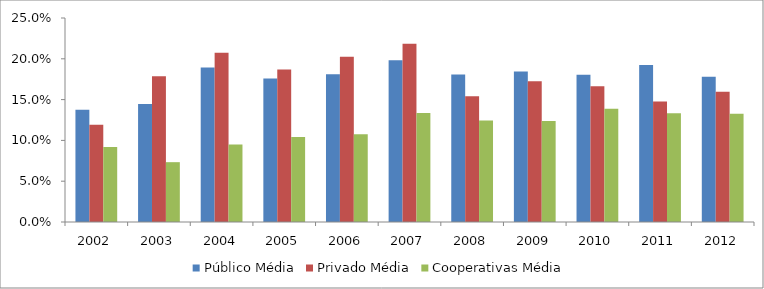
| Category | Público Média | Privado Média | Cooperativas Média |
|---|---|---|---|
| 2002.0 | 0.138 | 0.119 | 0.092 |
| 2003.0 | 0.145 | 0.179 | 0.073 |
| 2004.0 | 0.189 | 0.207 | 0.095 |
| 2005.0 | 0.176 | 0.187 | 0.104 |
| 2006.0 | 0.181 | 0.203 | 0.107 |
| 2007.0 | 0.198 | 0.218 | 0.133 |
| 2008.0 | 0.181 | 0.154 | 0.124 |
| 2009.0 | 0.184 | 0.173 | 0.124 |
| 2010.0 | 0.181 | 0.166 | 0.139 |
| 2011.0 | 0.193 | 0.148 | 0.133 |
| 2012.0 | 0.178 | 0.16 | 0.133 |